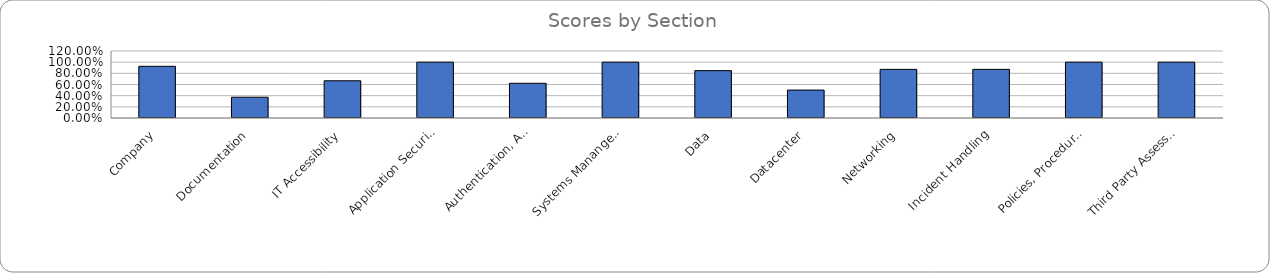
| Category | Series 0 |
|---|---|
| Company | 0.926 |
| Documentation | 0.372 |
| IT Accessibility | 0.667 |
| Application Security | 1 |
| Authentication, Authorization, and Accounting | 0.622 |
| Systems Manangement | 1 |
| Data | 0.848 |
| Datacenter | 0.5 |
| Networking | 0.871 |
| Incident Handling | 0.871 |
| Policies, Procedures, and Practices | 1 |
| Third Party Assessment | 1 |